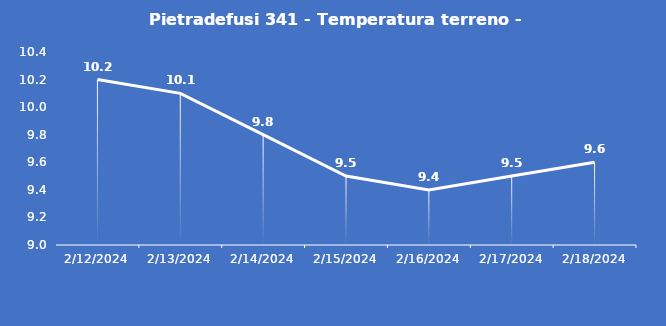
| Category | Pietradefusi 341 - Temperatura terreno - Grezzo (°C) |
|---|---|
| 2/12/24 | 10.2 |
| 2/13/24 | 10.1 |
| 2/14/24 | 9.8 |
| 2/15/24 | 9.5 |
| 2/16/24 | 9.4 |
| 2/17/24 | 9.5 |
| 2/18/24 | 9.6 |